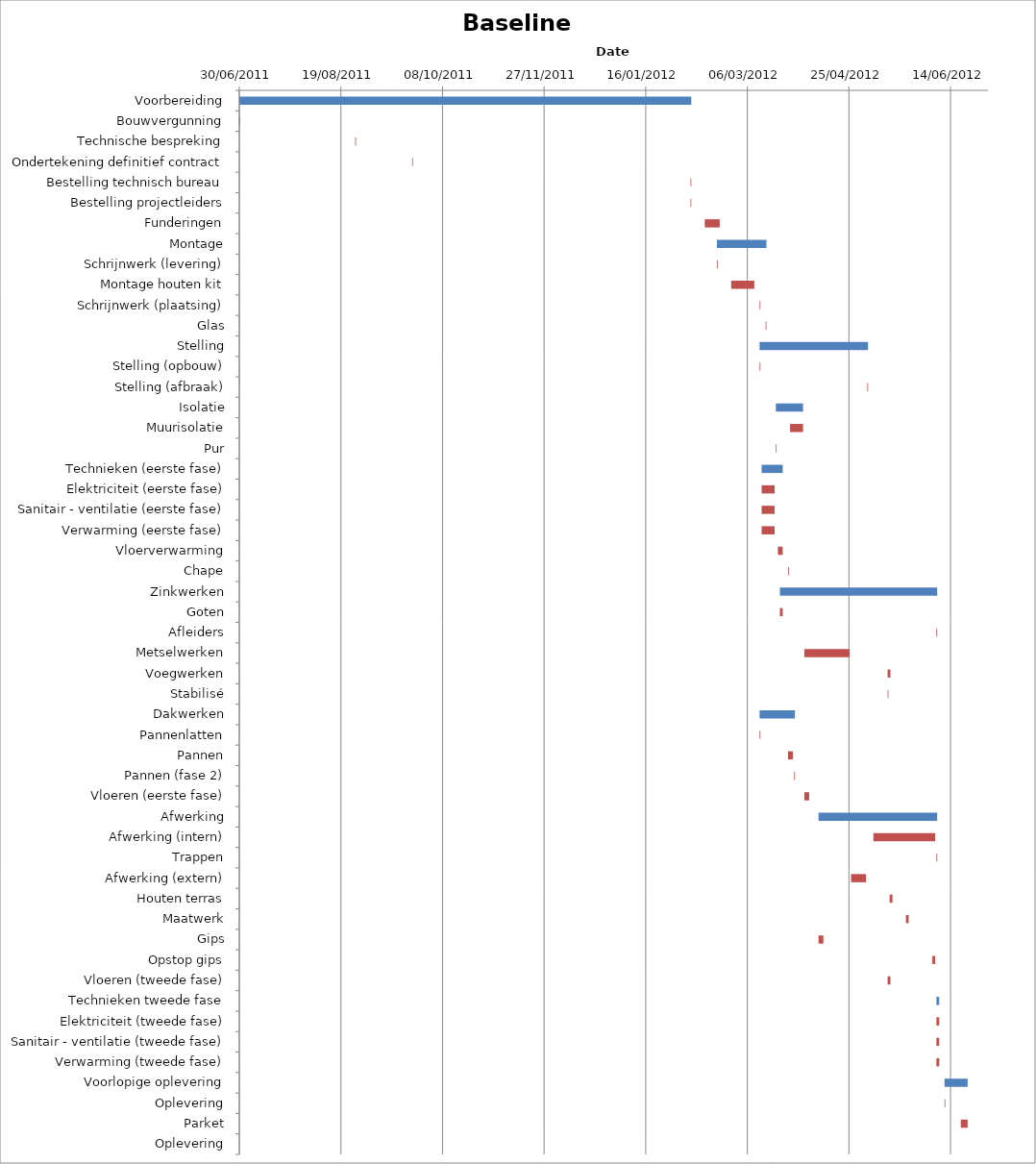
| Category | Baseline start | Actual duration |
|---|---|---|
| Voorbereiding | 40724.333 | 222.375 |
| Bouwvergunning | 40724.333 | 0.375 |
| Technische bespreking | 40781.333 | 0.375 |
| Ondertekening definitief contract | 40809.333 | 0.375 |
| Bestelling technisch bureau | 40946.333 | 0.375 |
| Bestelling projectleiders | 40946.333 | 0.375 |
| Funderingen | 40953.333 | 7.375 |
| Montage | 40959.333 | 24.375 |
| Schrijnwerk (levering) | 40959.333 | 0.375 |
| Montage houten kit | 40966.333 | 11.375 |
| Schrijnwerk (plaatsing) | 40980.333 | 0.375 |
| Glas | 40983.333 | 0.375 |
| Stelling | 40980.333 | 53.375 |
| Stelling (opbouw) | 40980.333 | 0.375 |
| Stelling (afbraak) | 41033.333 | 0.375 |
| Isolatie | 40988.333 | 13.375 |
| Muurisolatie | 40995.333 | 6.375 |
| Pur | 40988.333 | 0.375 |
| Technieken (eerste fase) | 40981.333 | 10.375 |
| Elektriciteit (eerste fase) | 40981.333 | 6.375 |
| Sanitair - ventilatie (eerste fase) | 40981.333 | 6.375 |
| Verwarming (eerste fase) | 40981.333 | 6.375 |
| Vloerverwarming | 40989.333 | 2.375 |
| Chape | 40994.333 | 0.375 |
| Zinkwerken | 40990.333 | 77.375 |
| Goten | 40990.333 | 1.375 |
| Afleiders | 41067.333 | 0.375 |
| Metselwerken | 41002.333 | 22.375 |
| Voegwerken | 41043.333 | 1.375 |
| Stabilisé | 41043.333 | 0.375 |
| Dakwerken | 40980.333 | 17.375 |
| Pannenlatten | 40980.333 | 0.375 |
| Pannen | 40994.333 | 2.375 |
| Pannen (fase 2) | 40997.333 | 0.375 |
| Vloeren (eerste fase) | 41002.333 | 2.375 |
| Afwerking | 41009.333 | 58.375 |
| Afwerking (intern) | 41036.333 | 30.375 |
| Trappen | 41067.333 | 0.375 |
| Afwerking (extern) | 41025.333 | 7.375 |
| Houten terras | 41044.333 | 1.375 |
| Maatwerk | 41052.333 | 1.375 |
| Gips | 41009.333 | 2.375 |
| Opstop gips | 41065.333 | 1.375 |
| Vloeren (tweede fase) | 41043.333 | 1.375 |
| Technieken tweede fase | 41067.333 | 1.375 |
| Elektriciteit (tweede fase) | 41067.333 | 1.375 |
| Sanitair - ventilatie (tweede fase) | 41067.333 | 1.375 |
| Verwarming (tweede fase) | 41067.333 | 1.375 |
| Voorlopige oplevering | 41071.333 | 11.375 |
| Oplevering | 41071.333 | 0.375 |
| Parket | 41079.333 | 3.375 |
| Oplevering | 41092.708 | 0 |